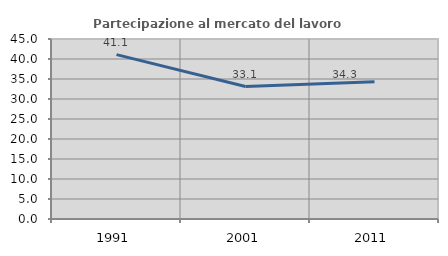
| Category | Partecipazione al mercato del lavoro  femminile |
|---|---|
| 1991.0 | 41.103 |
| 2001.0 | 33.106 |
| 2011.0 | 34.319 |